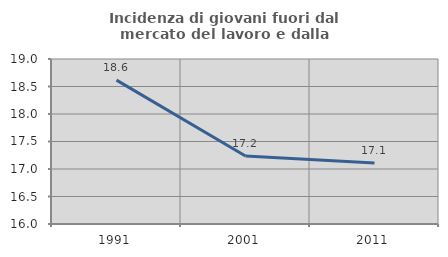
| Category | Incidenza di giovani fuori dal mercato del lavoro e dalla formazione  |
|---|---|
| 1991.0 | 18.616 |
| 2001.0 | 17.237 |
| 2011.0 | 17.109 |